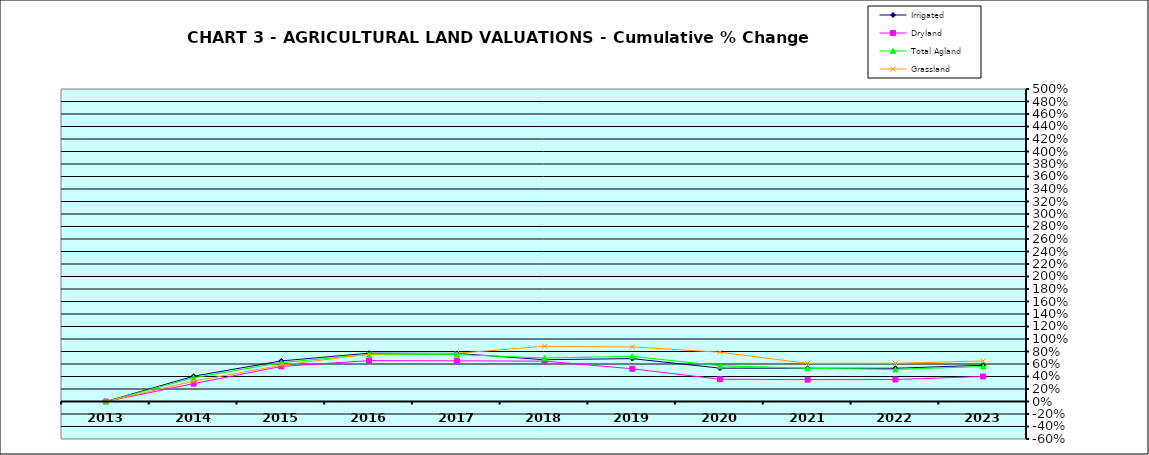
| Category | Irrigated | Dryland | Total Agland | Grassland |
|---|---|---|---|---|
| 2013.0 | 0 | 0 | 0 | 0 |
| 2014.0 | 0.405 | 0.286 | 0.38 | 0.324 |
| 2015.0 | 0.649 | 0.561 | 0.624 | 0.581 |
| 2016.0 | 0.773 | 0.654 | 0.75 | 0.76 |
| 2017.0 | 0.769 | 0.651 | 0.751 | 0.771 |
| 2018.0 | 0.668 | 0.646 | 0.696 | 0.884 |
| 2019.0 | 0.686 | 0.523 | 0.722 | 0.872 |
| 2020.0 | 0.534 | 0.357 | 0.572 | 0.788 |
| 2021.0 | 0.532 | 0.349 | 0.531 | 0.611 |
| 2022.0 | 0.532 | 0.352 | 0.513 | 0.611 |
| 2023.0 | 0.58 | 0.4 | 0.56 | 0.649 |